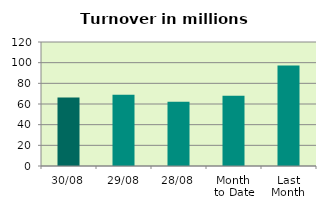
| Category | Series 0 |
|---|---|
| 30/08 | 66.327 |
| 29/08 | 69.025 |
| 28/08 | 62.198 |
| Month 
to Date | 68.085 |
| Last
Month | 97.283 |